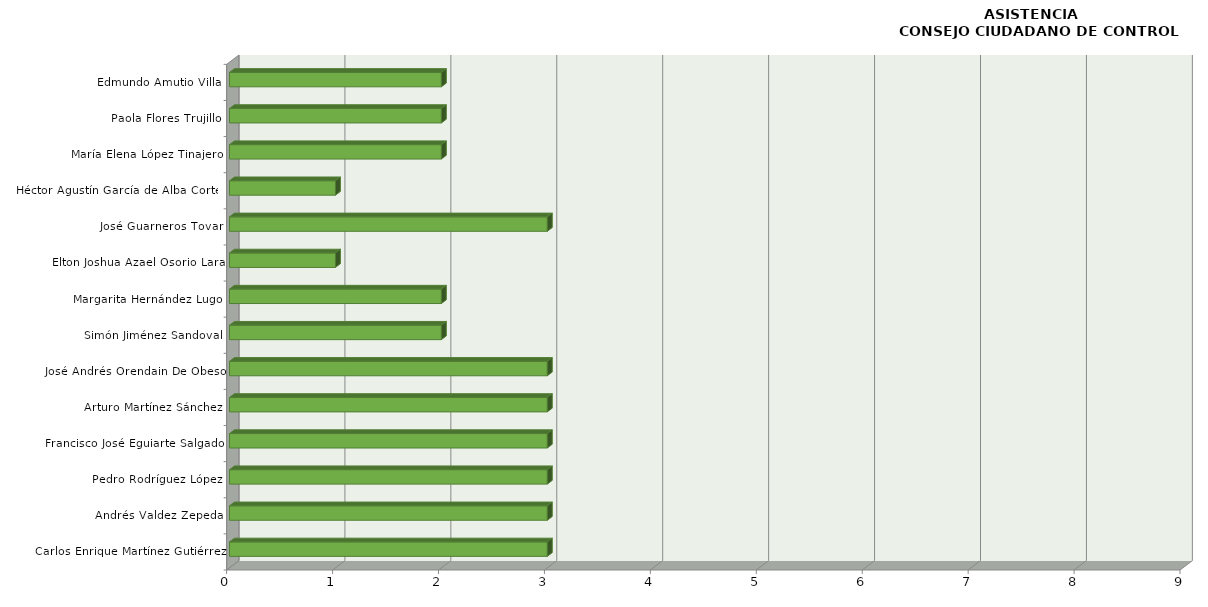
| Category | Series 0 |
|---|---|
| Carlos Enrique Martínez Gutiérrez | 3 |
| Andrés Valdez Zepeda | 3 |
| Pedro Rodríguez López | 3 |
| Francisco José Eguiarte Salgado | 3 |
| Arturo Martínez Sánchez | 3 |
| José Andrés Orendain De Obeso | 3 |
| Simón Jiménez Sandoval | 2 |
| Margarita Hernández Lugo | 2 |
| Elton Joshua Azael Osorio Lara | 1 |
| José Guarneros Tovar | 3 |
| Héctor Agustín García de Alba Cortez | 1 |
| María Elena López Tinajero | 2 |
| Paola Flores Trujillo | 2 |
| Edmundo Amutio Villa | 2 |